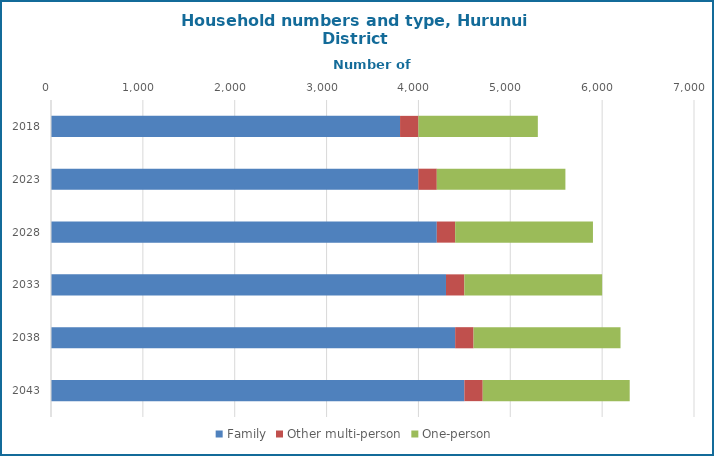
| Category | Family | Other multi-person | One-person |
|---|---|---|---|
| 2018.0 | 3800 | 200 | 1300 |
| 2023.0 | 4000 | 200 | 1400 |
| 2028.0 | 4200 | 200 | 1500 |
| 2033.0 | 4300 | 200 | 1500 |
| 2038.0 | 4400 | 200 | 1600 |
| 2043.0 | 4500 | 200 | 1600 |